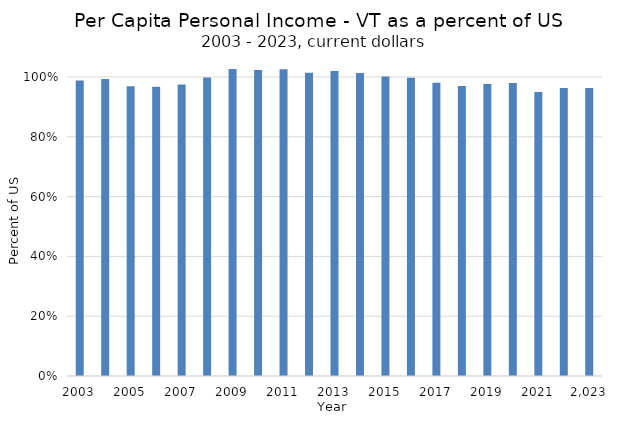
| Category | Vermont |
|---|---|
| 2023 | 0.963 |
| 2022 | 0.963 |
| 2021 | 0.95 |
| 2020 | 0.98 |
| 2019 | 0.977 |
| 2018 | 0.97 |
| 2017 | 0.981 |
| 2016 | 0.997 |
| 2015 | 1.001 |
| 2014 | 1.013 |
| 2013 | 1.02 |
| 2012 | 1.014 |
| 2011 | 1.026 |
| 2010 | 1.023 |
| 2009 | 1.027 |
| 2008 | 0.998 |
| 2007 | 0.975 |
| 2006 | 0.967 |
| 2005 | 0.969 |
| 2004 | 0.993 |
| 2003 | 0.988 |